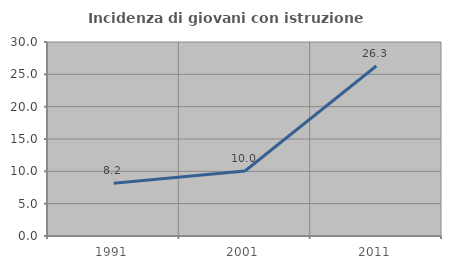
| Category | Incidenza di giovani con istruzione universitaria |
|---|---|
| 1991.0 | 8.155 |
| 2001.0 | 10.046 |
| 2011.0 | 26.289 |